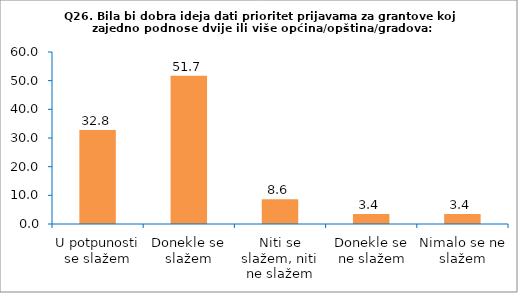
| Category | Series 0 |
|---|---|
| U potpunosti se slažem | 32.759 |
| Donekle se slažem | 51.724 |
| Niti se slažem, niti ne slažem | 8.621 |
| Donekle se ne slažem | 3.448 |
| Nimalo se ne slažem | 3.448 |